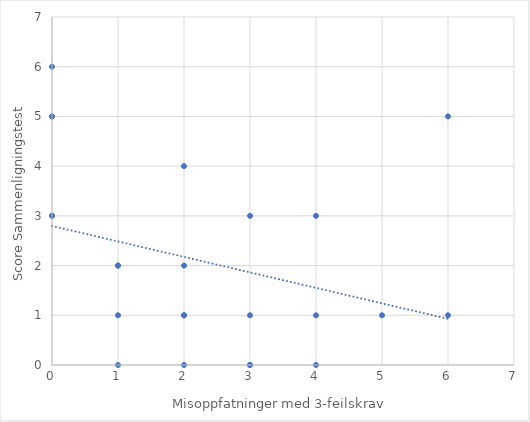
| Category | Series 0 |
|---|---|
| 2.0 | 0 |
| 0.0 | 3 |
| 1.0 | 1 |
| 0.0 | 3 |
| 0.0 | 5 |
| 3.0 | 1 |
| 4.0 | 0 |
| 6.0 | 5 |
| 3.0 | 3 |
| 5.0 | 1 |
| 1.0 | 2 |
| 2.0 | 4 |
| 1.0 | 0 |
| 0.0 | 6 |
| 0.0 | 5 |
| 3.0 | 0 |
| 2.0 | 2 |
| 4.0 | 3 |
| 1.0 | 2 |
| 2.0 | 1 |
| 4.0 | 1 |
| 2.0 | 1 |
| 3.0 | 0 |
| 6.0 | 1 |